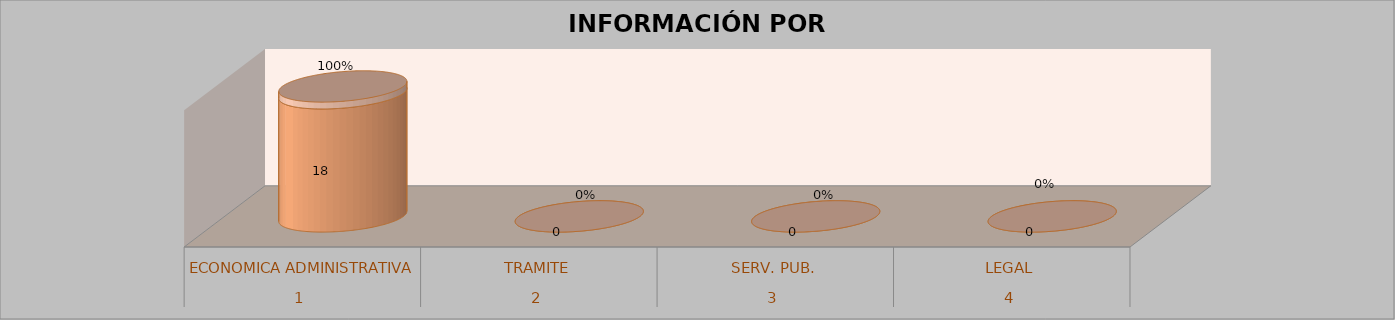
| Category | Series 0 | Series 1 | Series 2 | Series 3 |
|---|---|---|---|---|
| 0 |  |  | 18 | 1 |
| 1 |  |  | 0 | 0 |
| 2 |  |  | 0 | 0 |
| 3 |  |  | 0 | 0 |